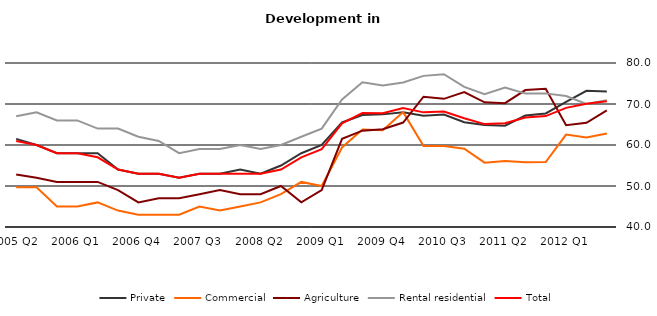
| Category | Private | Commercial | Agriculture | Rental residential | Total |
|---|---|---|---|---|---|
| 2005 Q2 | 61.5 | 49.7 | 52.8 | 67 | 61 |
| 2005 Q3 | 60 | 49.7 | 52 | 68 | 60 |
| 2005 Q4 | 58 | 45 | 51 | 66 | 58 |
| 2006 Q1 | 58 | 45 | 51 | 66 | 58 |
| 2006 Q2 | 58 | 46 | 51 | 64 | 57 |
| 2006 Q3 | 54 | 44 | 49 | 64 | 54 |
| 2006 Q4 | 53 | 43 | 46 | 62 | 53 |
| 2007 Q1 | 53 | 43 | 47 | 61 | 53 |
| 2007 Q2 | 52 | 43 | 47 | 58 | 52 |
| 2007 Q3 | 53 | 45 | 48 | 59 | 53 |
| 2007 Q4 | 53 | 44 | 49 | 59 | 53 |
| 2008 Q1 | 54 | 45 | 48 | 60 | 53 |
| 2008 Q2 | 53 | 46 | 48 | 59 | 53 |
| 2008 Q3 | 55 | 48 | 50 | 60 | 54 |
| 2008 Q4 | 58 | 51 | 46 | 62 | 57 |
| 2009 Q1 | 60 | 50 | 49 | 64 | 59 |
| 2009 Q2 | 65.5 | 59.4 | 61.5 | 71.1 | 65.3 |
| 2009 Q3 | 67.3 | 63.8 | 63.5 | 75.3 | 67.8 |
| 2009 Q4 | 67.47 | 63.58 | 63.86 | 74.51 | 67.77 |
| 2010 Q1 | 67.97 | 68.02 | 65.48 | 75.24 | 69.01 |
| 2010 Q2 | 67.16 | 59.75 | 71.77 | 76.86 | 67.96 |
| 2010 Q3 | 67.45 | 59.73 | 71.26 | 77.27 | 68.16 |
| 2010 Q4 | 65.57 | 59.11 | 72.9 | 74.19 | 66.53 |
| 2011 Q1 | 64.9 | 55.7 | 70.4 | 72.4 | 65.1 |
| 2011 Q2 | 64.7 | 56.1 | 70.2 | 74 | 65.3 |
| 2011 Q3 | 67.18 | 55.81 | 73.4 | 72.58 | 66.7 |
| 2011 Q4 | 67.69 | 55.86 | 73.69 | 72.59 | 67.06 |
| 2012 Q1 | 70.54 | 62.55 | 64.82 | 71.95 | 69.06 |
| 2012 Q2 | 73.22 | 61.82 | 65.42 | 70 | 70.05 |
| 2012 Q3 | 73.04 | 62.82 | 68.44 | 70.89 | 70.65 |